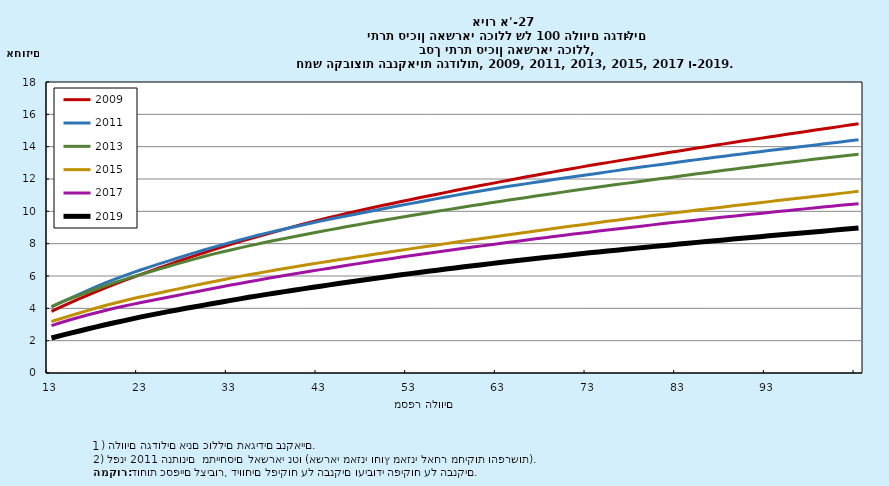
| Category | 2009 | 2011 | 2013 | 2015 | 2017 | 2019 |
|---|---|---|---|---|---|---|
| 13.0 | 3.818 | 4.09 | 4.107 | 3.182 | 2.934 | 2.165 |
| 14.0 | 4.078 | 4.349 | 4.346 | 3.356 | 3.111 | 2.309 |
| 15.0 | 4.324 | 4.601 | 4.578 | 3.529 | 3.276 | 2.447 |
| 16.0 | 4.566 | 4.852 | 4.79 | 3.695 | 3.434 | 2.585 |
| 17.0 | 4.802 | 5.103 | 4.995 | 3.86 | 3.584 | 2.721 |
| 18.0 | 5.036 | 5.345 | 5.197 | 4.02 | 3.731 | 2.854 |
| 19.0 | 5.262 | 5.577 | 5.393 | 4.179 | 3.867 | 2.981 |
| 20.0 | 5.486 | 5.786 | 5.582 | 4.319 | 4.002 | 3.105 |
| 21.0 | 5.707 | 5.991 | 5.762 | 4.458 | 4.125 | 3.228 |
| 22.0 | 5.908 | 6.195 | 5.934 | 4.588 | 4.246 | 3.348 |
| 23.0 | 6.106 | 6.385 | 6.101 | 4.711 | 4.36 | 3.468 |
| 24.0 | 6.302 | 6.567 | 6.265 | 4.833 | 4.471 | 3.583 |
| 25.0 | 6.498 | 6.746 | 6.429 | 4.953 | 4.581 | 3.691 |
| 26.0 | 6.691 | 6.923 | 6.59 | 5.072 | 4.691 | 3.798 |
| 27.0 | 6.883 | 7.1 | 6.749 | 5.19 | 4.8 | 3.9 |
| 28.0 | 7.075 | 7.273 | 6.908 | 5.304 | 4.908 | 4.002 |
| 29.0 | 7.261 | 7.442 | 7.061 | 5.419 | 5.016 | 4.101 |
| 30.0 | 7.44 | 7.612 | 7.21 | 5.533 | 5.123 | 4.2 |
| 31.0 | 7.62 | 7.771 | 7.351 | 5.645 | 5.228 | 4.298 |
| 32.0 | 7.79 | 7.925 | 7.486 | 5.757 | 5.334 | 4.396 |
| 33.0 | 7.96 | 8.078 | 7.613 | 5.867 | 5.438 | 4.491 |
| 34.0 | 8.124 | 8.227 | 7.738 | 5.976 | 5.54 | 4.586 |
| 35.0 | 8.287 | 8.374 | 7.862 | 6.076 | 5.641 | 4.68 |
| 36.0 | 8.441 | 8.518 | 7.982 | 6.174 | 5.742 | 4.772 |
| 37.0 | 8.594 | 8.651 | 8.1 | 6.27 | 5.839 | 4.862 |
| 38.0 | 8.748 | 8.783 | 8.209 | 6.367 | 5.935 | 4.949 |
| 39.0 | 8.9 | 8.912 | 8.318 | 6.46 | 6.029 | 5.034 |
| 40.0 | 9.051 | 9.034 | 8.427 | 6.553 | 6.121 | 5.119 |
| 41.0 | 9.198 | 9.154 | 8.534 | 6.645 | 6.213 | 5.203 |
| 42.0 | 9.343 | 9.274 | 8.641 | 6.736 | 6.304 | 5.286 |
| 43.0 | 9.48 | 9.393 | 8.747 | 6.826 | 6.395 | 5.37 |
| 44.0 | 9.617 | 9.505 | 8.852 | 6.916 | 6.486 | 5.453 |
| 45.0 | 9.748 | 9.616 | 8.956 | 7.002 | 6.575 | 5.533 |
| 46.0 | 9.877 | 9.727 | 9.057 | 7.087 | 6.663 | 5.613 |
| 47.0 | 10.005 | 9.836 | 9.159 | 7.173 | 6.75 | 5.692 |
| 48.0 | 10.131 | 9.945 | 9.256 | 7.257 | 6.836 | 5.77 |
| 49.0 | 10.254 | 10.054 | 9.351 | 7.342 | 6.922 | 5.849 |
| 50.0 | 10.372 | 10.161 | 9.445 | 7.427 | 7.007 | 5.926 |
| 51.0 | 10.49 | 10.267 | 9.539 | 7.511 | 7.089 | 6 |
| 52.0 | 10.606 | 10.372 | 9.632 | 7.595 | 7.169 | 6.074 |
| 53.0 | 10.721 | 10.477 | 9.725 | 7.678 | 7.249 | 6.148 |
| 54.0 | 10.836 | 10.581 | 9.817 | 7.761 | 7.327 | 6.219 |
| 55.0 | 10.949 | 10.684 | 9.909 | 7.843 | 7.405 | 6.29 |
| 56.0 | 11.061 | 10.787 | 10 | 7.923 | 7.482 | 6.359 |
| 57.0 | 11.173 | 10.888 | 10.09 | 8.003 | 7.56 | 6.429 |
| 58.0 | 11.284 | 10.988 | 10.181 | 8.083 | 7.636 | 6.498 |
| 59.0 | 11.392 | 11.088 | 10.27 | 8.162 | 7.713 | 6.566 |
| 60.0 | 11.501 | 11.184 | 10.358 | 8.242 | 7.789 | 6.633 |
| 61.0 | 11.608 | 11.279 | 10.443 | 8.32 | 7.864 | 6.7 |
| 62.0 | 11.715 | 11.371 | 10.528 | 8.399 | 7.938 | 6.765 |
| 63.0 | 11.821 | 11.459 | 10.612 | 8.477 | 8.011 | 6.829 |
| 64.0 | 11.926 | 11.546 | 10.695 | 8.555 | 8.085 | 6.893 |
| 65.0 | 12.031 | 11.631 | 10.778 | 8.632 | 8.156 | 6.956 |
| 66.0 | 12.134 | 11.715 | 10.861 | 8.71 | 8.227 | 7.018 |
| 67.0 | 12.237 | 11.798 | 10.943 | 8.786 | 8.298 | 7.078 |
| 68.0 | 12.339 | 11.881 | 11.025 | 8.862 | 8.368 | 7.138 |
| 69.0 | 12.441 | 11.963 | 11.107 | 8.937 | 8.439 | 7.198 |
| 70.0 | 12.539 | 12.044 | 11.188 | 9.012 | 8.508 | 7.257 |
| 71.0 | 12.637 | 12.123 | 11.268 | 9.087 | 8.576 | 7.316 |
| 72.0 | 12.733 | 12.203 | 11.347 | 9.161 | 8.643 | 7.374 |
| 73.0 | 12.829 | 12.282 | 11.425 | 9.235 | 8.71 | 7.432 |
| 74.0 | 12.922 | 12.361 | 11.502 | 9.309 | 8.777 | 7.488 |
| 75.0 | 13.014 | 12.44 | 11.579 | 9.382 | 8.843 | 7.544 |
| 76.0 | 13.106 | 12.519 | 11.654 | 9.454 | 8.908 | 7.599 |
| 77.0 | 13.197 | 12.598 | 11.729 | 9.525 | 8.972 | 7.654 |
| 78.0 | 13.289 | 12.675 | 11.804 | 9.595 | 9.036 | 7.708 |
| 79.0 | 13.38 | 12.751 | 11.878 | 9.666 | 9.099 | 7.763 |
| 80.0 | 13.47 | 12.827 | 11.952 | 9.736 | 9.163 | 7.816 |
| 81.0 | 13.56 | 12.903 | 12.026 | 9.805 | 9.226 | 7.87 |
| 82.0 | 13.649 | 12.978 | 12.1 | 9.873 | 9.287 | 7.923 |
| 83.0 | 13.738 | 13.052 | 12.173 | 9.941 | 9.348 | 7.976 |
| 84.0 | 13.827 | 13.126 | 12.246 | 10.009 | 9.408 | 8.028 |
| 85.0 | 13.914 | 13.199 | 12.32 | 10.076 | 9.467 | 8.079 |
| 86.0 | 14.001 | 13.27 | 12.392 | 10.142 | 9.526 | 8.131 |
| 87.0 | 14.087 | 13.342 | 12.463 | 10.208 | 9.584 | 8.182 |
| 88.0 | 14.174 | 13.412 | 12.534 | 10.274 | 9.642 | 8.232 |
| 89.0 | 14.259 | 13.482 | 12.605 | 10.34 | 9.7 | 8.283 |
| 90.0 | 14.345 | 13.552 | 12.675 | 10.406 | 9.758 | 8.334 |
| 91.0 | 14.429 | 13.621 | 12.745 | 10.471 | 9.815 | 8.385 |
| 92.0 | 14.513 | 13.689 | 12.815 | 10.535 | 9.872 | 8.434 |
| 93.0 | 14.597 | 13.757 | 12.883 | 10.6 | 9.929 | 8.484 |
| 94.0 | 14.681 | 13.825 | 12.95 | 10.665 | 9.985 | 8.533 |
| 95.0 | 14.765 | 13.893 | 13.018 | 10.729 | 10.041 | 8.582 |
| 96.0 | 14.847 | 13.96 | 13.086 | 10.793 | 10.097 | 8.631 |
| 97.0 | 14.929 | 14.028 | 13.153 | 10.858 | 10.152 | 8.679 |
| 98.0 | 15.011 | 14.095 | 13.219 | 10.922 | 10.206 | 8.727 |
| 99.0 | 15.093 | 14.161 | 13.285 | 10.985 | 10.261 | 8.775 |
| 100.0 | 15.174 | 14.228 | 13.347 | 11.048 | 10.316 | 8.822 |
| nan | 15.255 | 14.294 | 13.41 | 11.11 | 10.37 | 8.87 |
| nan | 15.335 | 14.359 | 13.471 | 11.173 | 10.423 | 8.916 |
| nan | 15.415 | 14.425 | 13.533 | 11.235 | 10.476 | 8.963 |